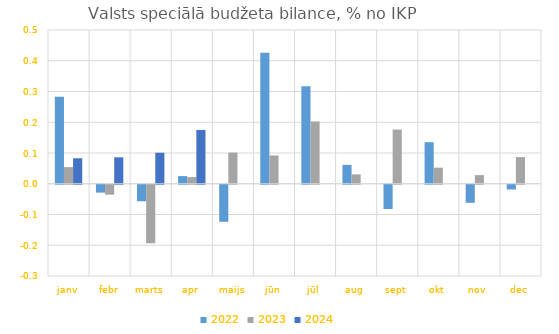
| Category | 2022 | 2023 | 2024 |
|---|---|---|---|
| janv | 0.283 | 0.054 | 0.083 |
| febr | -0.026 | -0.032 | 0.086 |
| marts | -0.054 | -0.19 | 0.101 |
| apr | 0.025 | 0.022 | 0.175 |
| maijs | -0.12 | 0.101 | 0 |
| jūn | 0.426 | 0.092 | 0 |
| jūl | 0.317 | 0.202 | 0 |
| aug | 0.061 | 0.031 | 0 |
| sept | -0.079 | 0.176 | 0 |
| okt | 0.135 | 0.052 | 0 |
| nov | -0.059 | 0.028 | 0 |
| dec | -0.015 | 0.087 | 0 |